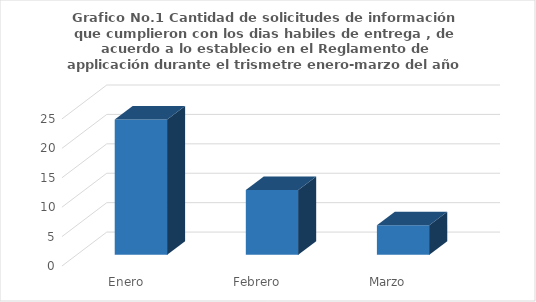
| Category | Series 0 |
|---|---|
| Enero | 23 |
| Febrero | 11 |
| Marzo | 5 |